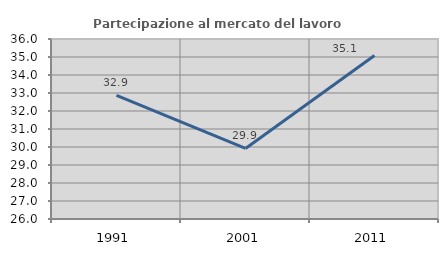
| Category | Partecipazione al mercato del lavoro  femminile |
|---|---|
| 1991.0 | 32.871 |
| 2001.0 | 29.918 |
| 2011.0 | 35.088 |